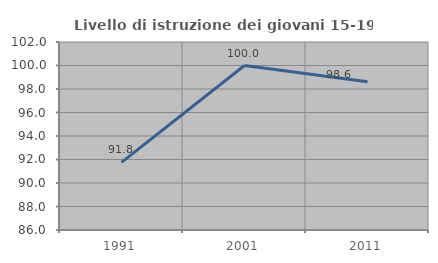
| Category | Livello di istruzione dei giovani 15-19 anni |
|---|---|
| 1991.0 | 91.753 |
| 2001.0 | 100 |
| 2011.0 | 98.611 |